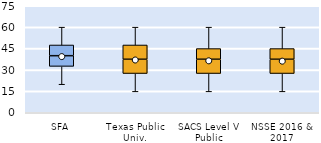
| Category | 25th | 50th | 75th |
|---|---|---|---|
| SFA | 32.5 | 7.5 | 7.5 |
| Texas Public Univ. | 27.5 | 10 | 10 |
| SACS Level V Public | 27.5 | 10 | 7.5 |
| NSSE 2016 & 2017 | 27.5 | 10 | 7.5 |